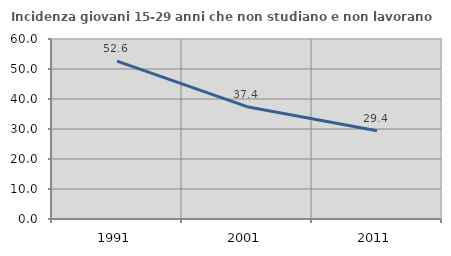
| Category | Incidenza giovani 15-29 anni che non studiano e non lavorano  |
|---|---|
| 1991.0 | 52.632 |
| 2001.0 | 37.442 |
| 2011.0 | 29.388 |